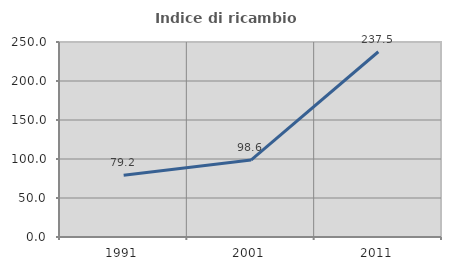
| Category | Indice di ricambio occupazionale  |
|---|---|
| 1991.0 | 79.174 |
| 2001.0 | 98.614 |
| 2011.0 | 237.5 |